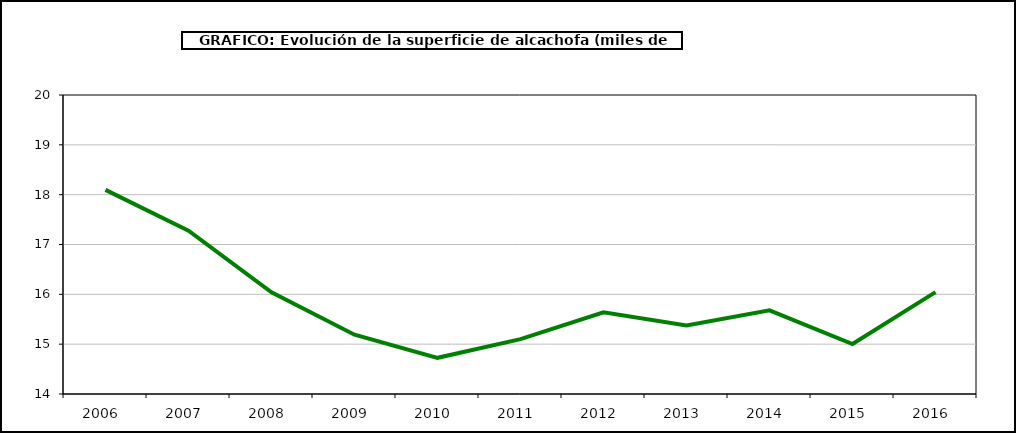
| Category | superficie |
|---|---|
| 2006.0 | 18.097 |
| 2007.0 | 17.277 |
| 2008.0 | 16.042 |
| 2009.0 | 15.19 |
| 2010.0 | 14.726 |
| 2011.0 | 15.1 |
| 2012.0 | 15.638 |
| 2013.0 | 15.376 |
| 2014.0 | 15.678 |
| 2015.0 | 15.002 |
| 2016.0 | 16.045 |